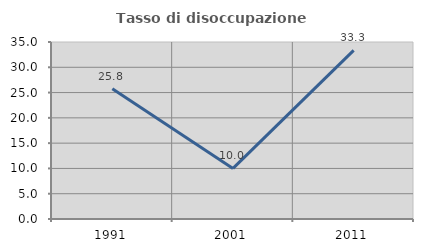
| Category | Tasso di disoccupazione giovanile  |
|---|---|
| 1991.0 | 25.758 |
| 2001.0 | 10 |
| 2011.0 | 33.333 |